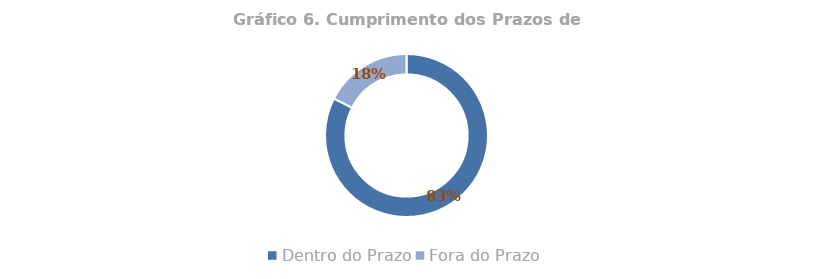
| Category | Total |
|---|---|
| Dentro do Prazo | 0.825 |
| Fora do Prazo | 0.175 |